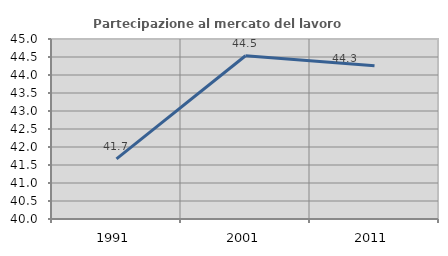
| Category | Partecipazione al mercato del lavoro  femminile |
|---|---|
| 1991.0 | 41.671 |
| 2001.0 | 44.534 |
| 2011.0 | 44.258 |